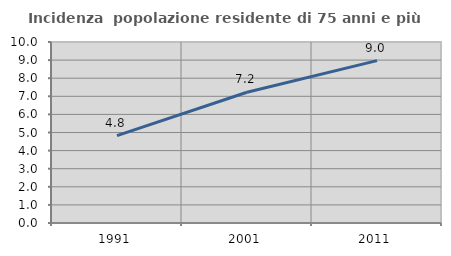
| Category | Incidenza  popolazione residente di 75 anni e più |
|---|---|
| 1991.0 | 4.829 |
| 2001.0 | 7.225 |
| 2011.0 | 8.973 |